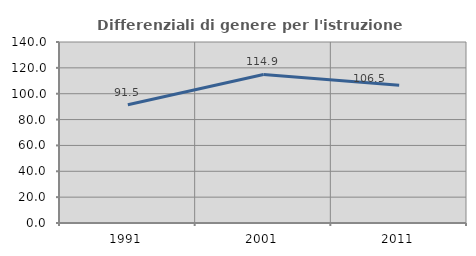
| Category | Differenziali di genere per l'istruzione superiore |
|---|---|
| 1991.0 | 91.531 |
| 2001.0 | 114.874 |
| 2011.0 | 106.503 |